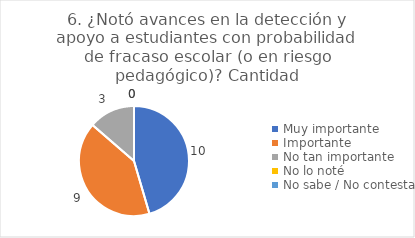
| Category | 6. ¿Notó avances en la detección y apoyo a estudiantes con probabilidad de fracaso escolar (o en riesgo pedagógico)? |
|---|---|
| Muy importante  | 0.455 |
| Importante  | 0.409 |
| No tan importante  | 0.136 |
| No lo noté  | 0 |
| No sabe / No contesta | 0 |